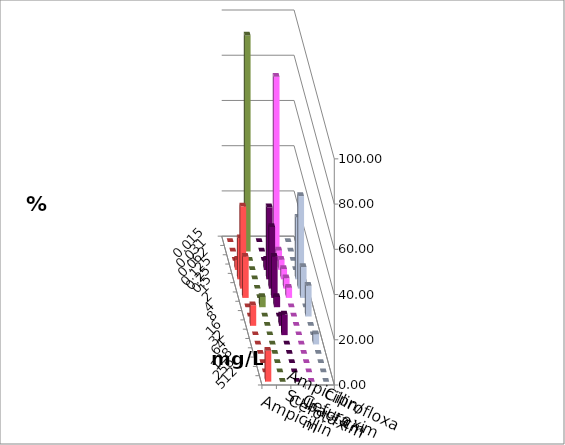
| Category | Ampicillin | Ampicillin/ Sulbactam | Cefotaxim | Cefuroxim | Ciprofloxacin |
|---|---|---|---|---|---|
| 0.015 | 0 | 0 | 0 | 0 | 0 |
| 0.031 | 0 | 0 | 77.273 | 0 | 95.455 |
| 0.062 | 0 | 0 | 4.545 | 0 | 0 |
| 0.125 | 4.545 | 4.545 | 4.545 | 0 | 0 |
| 0.25 | 18.182 | 31.818 | 4.545 | 27.273 | 0 |
| 0.5 | 36.364 | 27.273 | 4.545 | 40.909 | 0 |
| 1.0 | 18.182 | 18.182 | 4.545 | 13.636 | 0 |
| 2.0 | 0 | 4.545 | 0 | 0 | 4.545 |
| 4.0 | 0 | 0 | 0 | 13.636 | 0 |
| 8.0 | 9.091 | 4.545 | 0 | 0 | 0 |
| 16.0 | 0 | 9.091 | 0 | 0 | 0 |
| 32.0 | 0 | 0 | 0 | 4.545 | 0 |
| 64.0 | 0 | 0 | 0 | 0 | 0 |
| 128.0 | 0 | 0 | 0 | 0 | 0 |
| 256.0 | 0 | 0 | 0 | 0 | 0 |
| 512.0 | 13.636 | 0 | 0 | 0 | 0 |